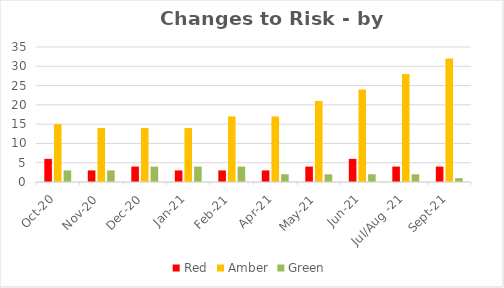
| Category | Red | Amber | Green |
|---|---|---|---|
| Oct-20 | 6 | 15 | 3 |
| Nov-20 | 3 | 14 | 3 |
| Dec-20 | 4 | 14 | 4 |
| Jan-21 | 3 | 14 | 4 |
| Feb-21 | 3 | 17 | 4 |
| Apr-21 | 3 | 17 | 2 |
| May-21 | 4 | 21 | 2 |
| Jun-21 | 6 | 24 | 2 |
| Jul/Aug -21 | 4 | 28 | 2 |
| Sep-21 | 4 | 32 | 1 |